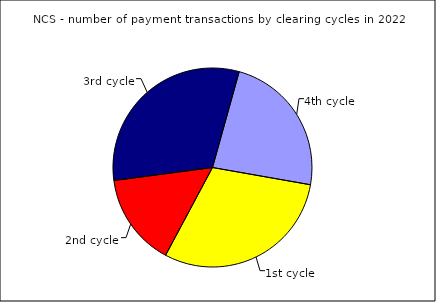
| Category | Series 0 |
|---|---|
| 1st cycle | 0.3 |
| 2nd cycle | 0.151 |
| 3rd cycle | 0.314 |